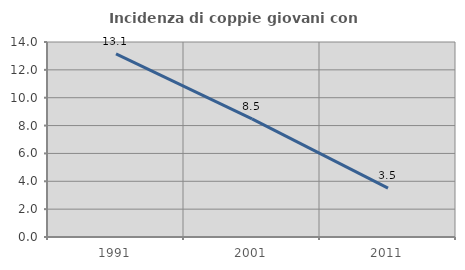
| Category | Incidenza di coppie giovani con figli |
|---|---|
| 1991.0 | 13.143 |
| 2001.0 | 8.475 |
| 2011.0 | 3.509 |